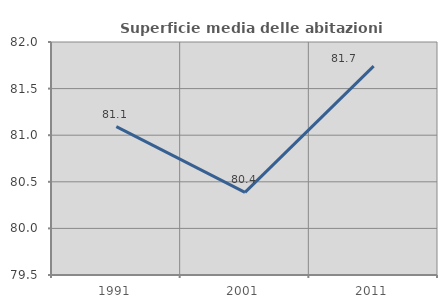
| Category | Superficie media delle abitazioni occupate |
|---|---|
| 1991.0 | 81.092 |
| 2001.0 | 80.386 |
| 2011.0 | 81.741 |